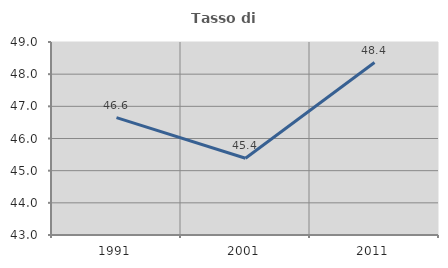
| Category | Tasso di occupazione   |
|---|---|
| 1991.0 | 46.648 |
| 2001.0 | 45.387 |
| 2011.0 | 48.361 |